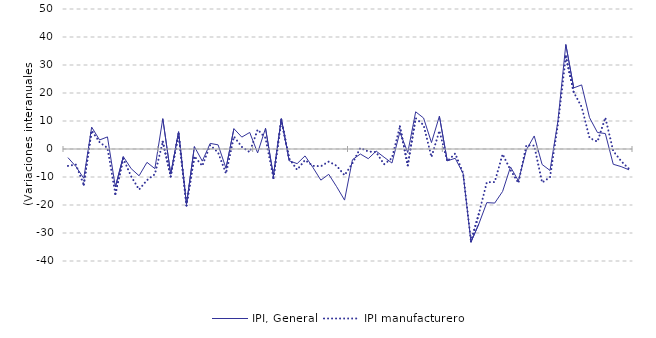
| Category | IPI, General | IPI manufacturero |
|---|---|---|
| nan | -3.08 | -6.04 |
| nan | -6.24 | -5.57 |
| nan | -10.45 | -12.69 |
| nan | 7.82 | 6.58 |
| nan | 3.22 | 2.42 |
| 2016.0 | 4.32 | 0.37 |
| nan | -13.55 | -16.06 |
| nan | -2.71 | -3.37 |
| nan | -7.02 | -9.81 |
| nan | -9.56 | -14.5 |
| nan | -4.77 | -11.14 |
| nan | -7.01 | -9 |
| nan | 10.83 | 2.58 |
| nan | -8.96 | -9.81 |
| nan | 6.17 | 5.4 |
| nan | -19.74 | -20.18 |
| nan | 0.86 | -2.58 |
| 2017.0 | -4.33 | -6.03 |
| nan | 2 | 1.38 |
| nan | 1.48 | -1.28 |
| nan | -6.89 | -8.76 |
| nan | 7.26 | 4.45 |
| nan | 4.25 | 0.77 |
| nan | 5.91 | -1.12 |
| nan | -1.4 | 6.93 |
| nan | 7.4 | 3.94 |
| nan | -9.6 | -10.35 |
| nan | 10.84 | 10.4 |
| nan | -4.21 | -3.45 |
| 2018.0 | -5.23 | -7.42 |
| nan | -2.47 | -3.94 |
| nan | -6.61 | -6.02 |
| nan | -11.12 | -6.16 |
| nan | -9.04 | -4.5 |
| nan | -13.47 | -6 |
| nan | -18.25 | -9.39 |
| nan | -3.821 | -5.099 |
| nan | -1.79 | 0.378 |
| nan | -3.453 | -0.882 |
| nan | -0.754 | -1.125 |
| nan | -2.935 | -5.451 |
| 2019.0 | -5.012 | -3.26 |
| nan | 6.059 | 8.02 |
| nan | -1.284 | -5.828 |
| nan | 13.284 | 11 |
| nan | 11.07 | 8.558 |
| nan | 2.301 | -2.883 |
| nan | 11.708 | 6.512 |
| nan | -4.239 | -4.391 |
| nan | -3.306 | -1.616 |
| nan | -8.737 | -8.562 |
| nan | -33.225 | -33.006 |
| nan | -26.705 | -23.062 |
| 2020.0 | -19.149 | -11.875 |
| nan | -19.311 | -11.811 |
| nan | -15.155 | -1.843 |
| nan | -6.406 | -7.506 |
| nan | -11.371 | -12.164 |
| nan | -0.356 | 1.331 |
| nan | 4.656 | 1.197 |
| nan | -5.54 | -11.98 |
| nan | -7.66 | -10.06 |
| nan | 9.99 | 8.82 |
| nan | 37.32 | 33.06 |
| nan | 21.83 | 20.25 |
| 2021.0 | 22.89 | 15.04 |
| nan | 11.19 | 3.96 |
| nan | 5.9 | 2.63 |
| nan | 5.52 | 11.22 |
| nan | -5.45 | -0.73 |
| nan | -6.29 | -4.31 |
| nan | -7.44 | -7.12 |